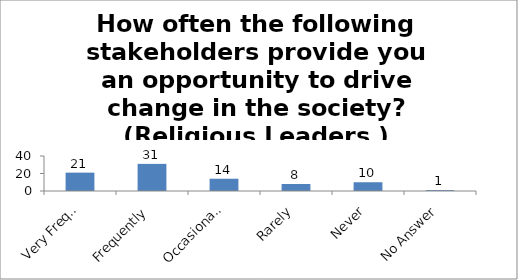
| Category | How often the following stakeholders provide you an opportunity to drive change in the society? (Religious Leaders ) |
|---|---|
| Very Frequently | 21 |
| Frequently | 31 |
| Occasionally | 14 |
| Rarely | 8 |
| Never | 10 |
| No Answer | 1 |